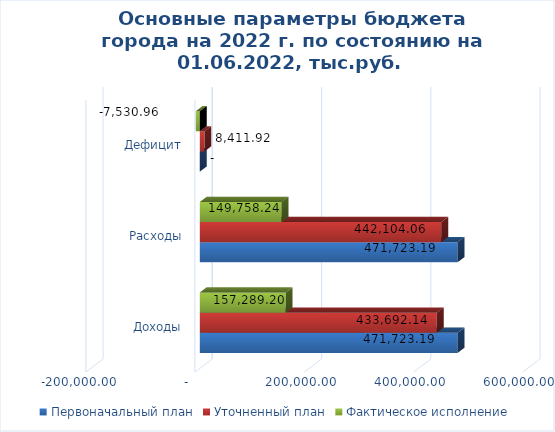
| Category | Первоначальный план | Уточненный план | Фактическое исполнение |
|---|---|---|---|
| Доходы | 471723.19 | 433692.14 | 157289.2 |
| Расходы | 471723.19 | 442104.06 | 149758.24 |
| Дефицит | 0 | 8411.92 | -7530.96 |